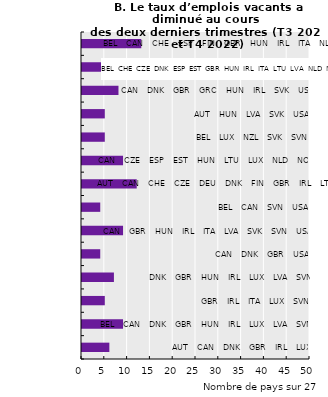
| Category | Nombre de pays | Labels SPOTS |
|---|---|---|
| 0 | 6 | 50 |
| 1 | 9 | 50 |
| 2 | 5 | 50 |
| 3 | 7 | 50 |
| 4 | 4 | 50 |
| 5 | 9 | 50 |
| 6 | 4 | 50 |
| 7 | 12 | 50 |
| 8 | 9 | 50 |
| 9 | 5 | 50 |
| 10 | 5 | 50 |
| 11 | 8 | 50 |
| 12 | 19 | 50 |
| 13 | 13 | 50 |